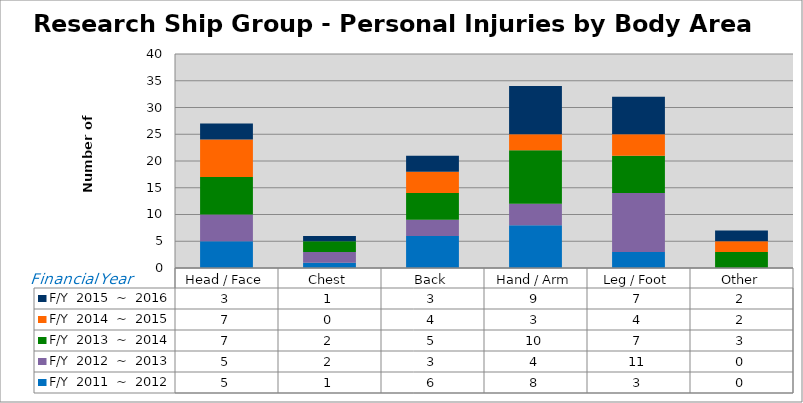
| Category | F/Y  2011  ~  2012 | F/Y  2012  ~  2013 | F/Y  2013  ~  2014 | F/Y  2014  ~  2015 | F/Y  2015  ~  2016 |
|---|---|---|---|---|---|
| Head / Face | 5 | 5 | 7 | 7 | 3 |
| Chest | 1 | 2 | 2 | 0 | 1 |
| Back | 6 | 3 | 5 | 4 | 3 |
| Hand / Arm | 8 | 4 | 10 | 3 | 9 |
| Leg / Foot | 3 | 11 | 7 | 4 | 7 |
| Other | 0 | 0 | 3 | 2 | 2 |